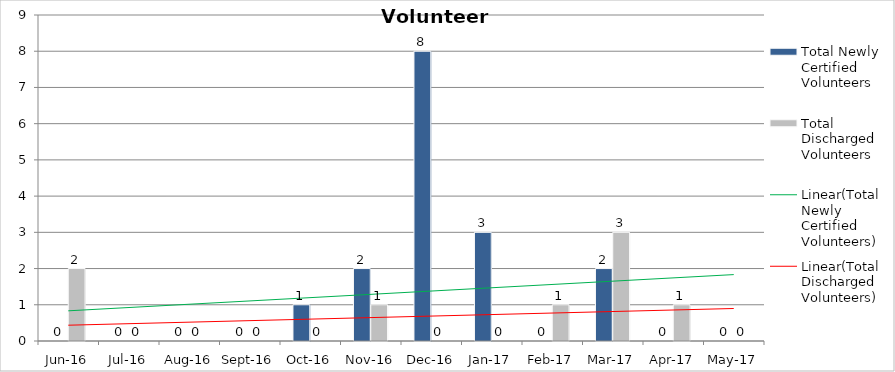
| Category | Total Newly Certified Volunteers | Total Discharged Volunteers |
|---|---|---|
| Jun-16 | 0 | 2 |
| Jul-16 | 0 | 0 |
| Aug-16 | 0 | 0 |
| Sep-16 | 0 | 0 |
| Oct-16 | 1 | 0 |
| Nov-16 | 2 | 1 |
| Dec-16 | 8 | 0 |
| Jan-17 | 3 | 0 |
| Feb-17 | 0 | 1 |
| Mar-17 | 2 | 3 |
| Apr-17 | 0 | 1 |
| May-17 | 0 | 0 |